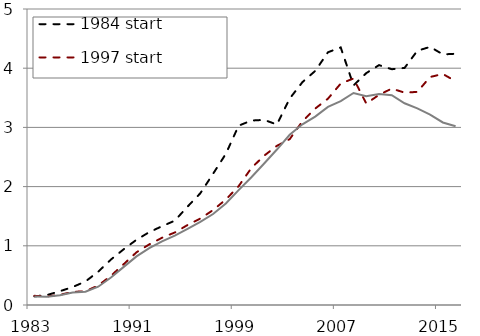
| Category | 1984 start | 1997 start | Actual trust fund ratio |
|---|---|---|---|
| 1983.0 | 0.145 | 0.155 | 0.145 |
| 1984.0 | 0.169 | 0.145 | 0.138 |
| 1985.0 | 0.233 | 0.172 | 0.163 |
| 1986.0 | 0.304 | 0.221 | 0.209 |
| 1987.0 | 0.397 | 0.233 | 0.224 |
| 1988.0 | 0.562 | 0.329 | 0.309 |
| 1989.0 | 0.768 | 0.493 | 0.465 |
| 1990.0 | 0.942 | 0.69 | 0.644 |
| 1991.0 | 1.102 | 0.89 | 0.822 |
| 1992.0 | 1.231 | 1.024 | 0.962 |
| 1993.0 | 1.331 | 1.136 | 1.074 |
| 1994.0 | 1.425 | 1.225 | 1.171 |
| 1995.0 | 1.662 | 1.351 | 1.284 |
| 1996.0 | 1.887 | 1.46 | 1.403 |
| 1997.0 | 2.217 | 1.604 | 1.536 |
| 1998.0 | 2.553 | 1.782 | 1.715 |
| 1999.0 | 3.029 | 2.007 | 1.941 |
| 2000.0 | 3.116 | 2.314 | 2.159 |
| 2001.0 | 3.127 | 2.522 | 2.391 |
| 2002.0 | 3.048 | 2.689 | 2.626 |
| 2003.0 | 3.487 | 2.801 | 2.876 |
| 2004.0 | 3.765 | 3.102 | 3.052 |
| 2005.0 | 3.954 | 3.318 | 3.183 |
| 2006.0 | 4.269 | 3.485 | 3.347 |
| 2007.0 | 4.352 | 3.741 | 3.445 |
| 2008.0 | 3.709 | 3.826 | 3.581 |
| 2009.0 | 3.917 | 3.403 | 3.527 |
| 2010.0 | 4.052 | 3.55 | 3.565 |
| 2011.0 | 3.983 | 3.656 | 3.544 |
| 2012.0 | 4.004 | 3.587 | 3.408 |
| 2013.0 | 4.294 | 3.6 | 3.32 |
| 2014.0 | 4.36 | 3.851 | 3.217 |
| 2015.0 | 4.233 | 3.902 | 3.083 |
| 2016.0 | 4.244 | 3.78 | 3.02 |